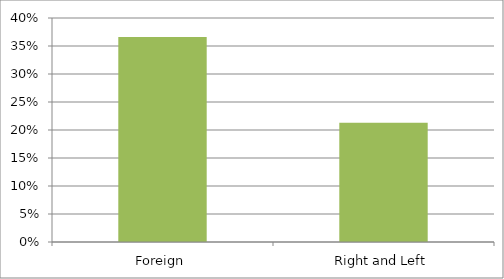
| Category | Series 0 |
|---|---|
| Foreign | 0.366 |
| Right and Left | 0.213 |